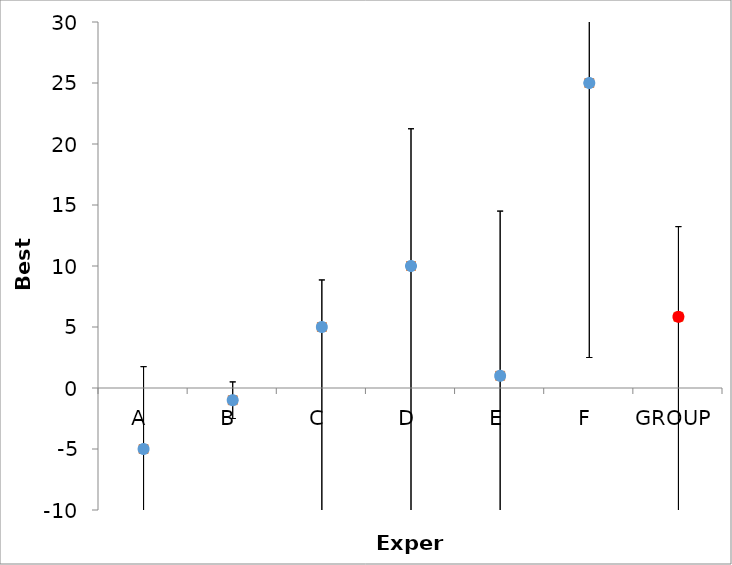
| Category | Series 1 | Series 0 |
|---|---|---|
| A | -5 | -5 |
| B | -1 | -1 |
| C | 5 | 5 |
| D | 10 | 10 |
| E | 1 | 1 |
| F | 25 | 25 |
| GROUP | 5.833 | 5.833 |